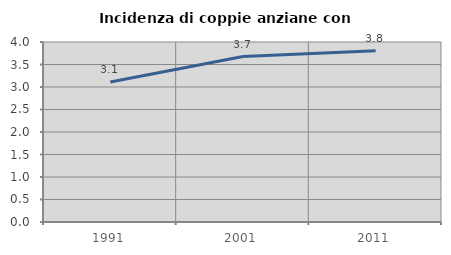
| Category | Incidenza di coppie anziane con figli |
|---|---|
| 1991.0 | 3.109 |
| 2001.0 | 3.676 |
| 2011.0 | 3.806 |